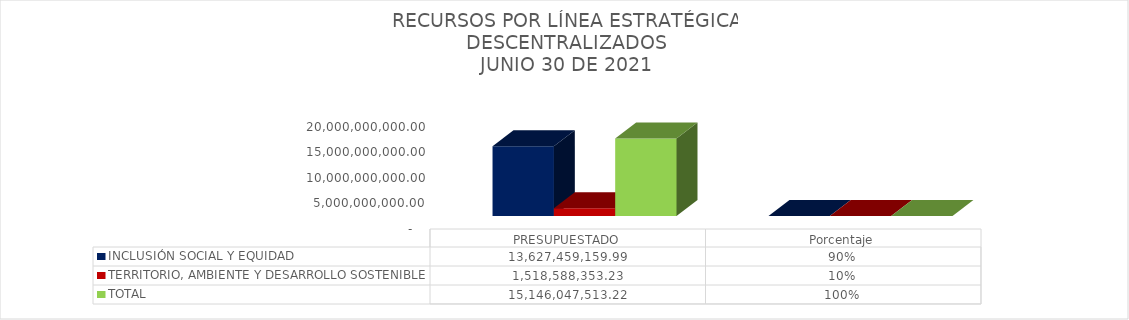
| Category | INCLUSIÓN SOCIAL Y EQUIDAD  | TERRITORIO, AMBIENTE Y DESARROLLO SOSTENIBLE  | TOTAL |
|---|---|---|---|
| PRESUPUESTADO | 13627459159.99 | 1518588353.23 | 15146047513.22 |
| Porcentaje | 0.9 | 0.1 | 1 |